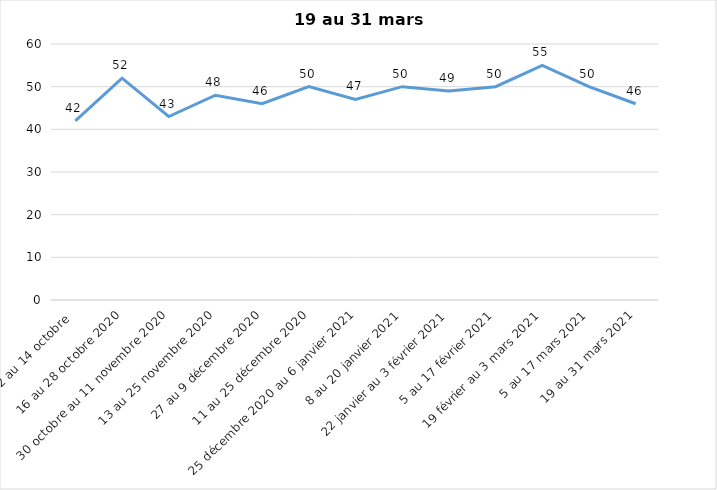
| Category | Toujours aux trois mesures |
|---|---|
| 2 au 14 octobre  | 42 |
| 16 au 28 octobre 2020 | 52 |
| 30 octobre au 11 novembre 2020 | 43 |
| 13 au 25 novembre 2020 | 48 |
| 27 au 9 décembre 2020 | 46 |
| 11 au 25 décembre 2020 | 50 |
| 25 décembre 2020 au 6 janvier 2021 | 47 |
| 8 au 20 janvier 2021 | 50 |
| 22 janvier au 3 février 2021 | 49 |
| 5 au 17 février 2021 | 50 |
| 19 février au 3 mars 2021 | 55 |
| 5 au 17 mars 2021 | 50 |
| 19 au 31 mars 2021 | 46 |